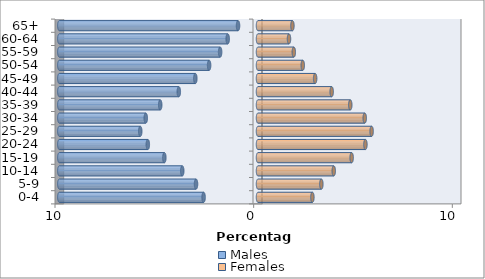
| Category | Males | Females |
|---|---|---|
| 0-4 | -2.738 | 2.738 |
| 5-9 | -3.12 | 3.189 |
| 10-14 | -3.813 | 3.813 |
| 15-19 | -4.714 | 4.714 |
| 20-24 | -5.546 | 5.407 |
| 25-29 | -5.927 | 5.719 |
| 30-34 | -5.65 | 5.373 |
| 35-39 | -4.922 | 4.645 |
| 40-44 | -3.986 | 3.709 |
| 45-49 | -3.154 | 2.877 |
| 50-54 | -2.461 | 2.253 |
| 55-59 | -1.906 | 1.802 |
| 60-64 | -1.525 | 1.56 |
| 65+ | -1.005 | 1.733 |